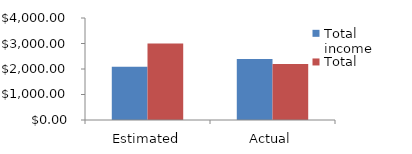
| Category | Total income | Total expenses |
|---|---|---|
| Estimated | 2090 | 3000 |
| Actual | 2393 | 2200 |